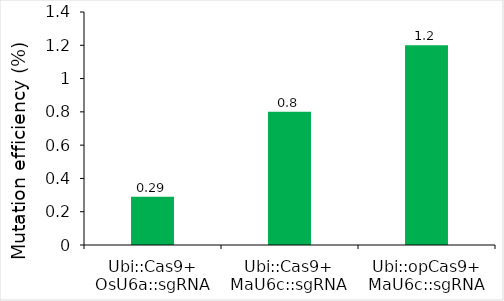
| Category | Series 0 |
|---|---|
| Ubi::Cas9+
OsU6a::sgRNA | 0.29 |
| Ubi::Cas9+
MaU6c::sgRNA | 0.8 |
| Ubi::opCas9+
MaU6c::sgRNA | 1.2 |